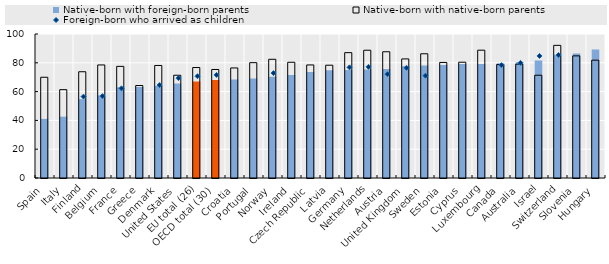
| Category | Native-born with foreign-born parents | Native-born with native-born parents |
|---|---|---|
| Spain | 41.053 | 69.965 |
| Italy | 42.613 | 61.348 |
| Finland | 54.773 | 73.792 |
| Belgium | 57.389 | 78.514 |
| France | 63.099 | 77.525 |
| Greece | 63.113 | 64.216 |
| Denmark | 63.902 | 78.139 |
| United States | 65.56 | 71.354 |
| EU total (26) | 67.059 | 76.72 |
| OECD total (30) | 68.095 | 75.368 |
| Croatia | 68.41 | 76.431 |
| Portugal | 69.018 | 80.092 |
| Norway | 70.295 | 82.436 |
| Ireland | 71.477 | 80.368 |
| Czech Republic | 73.599 | 78.509 |
| Latvia | 74.795 | 78.324 |
| Germany | 75.045 | 87.054 |
| Netherlands | 75.309 | 88.716 |
| Austria | 75.721 | 87.663 |
| United Kingdom | 77.53 | 82.7 |
| Sweden | 78.072 | 86.272 |
| Estonia | 78.405 | 80.249 |
| Cyprus | 79.135 | 80.413 |
| Luxembourg | 79.179 | 88.76 |
| Canada | 79.519 | 78.884 |
| Australia | 80.389 | 79.063 |
| Israel | 81.57 | 71.37 |
| Switzerland | 85.63 | 92.12 |
| Slovenia | 86.501 | 84.812 |
| Hungary | 89.321 | 81.817 |